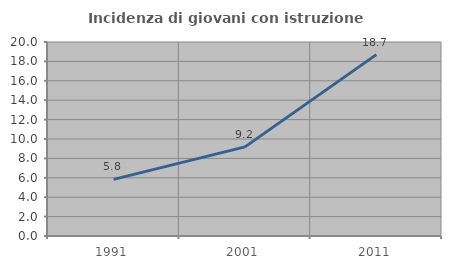
| Category | Incidenza di giovani con istruzione universitaria |
|---|---|
| 1991.0 | 5.841 |
| 2001.0 | 9.19 |
| 2011.0 | 18.697 |